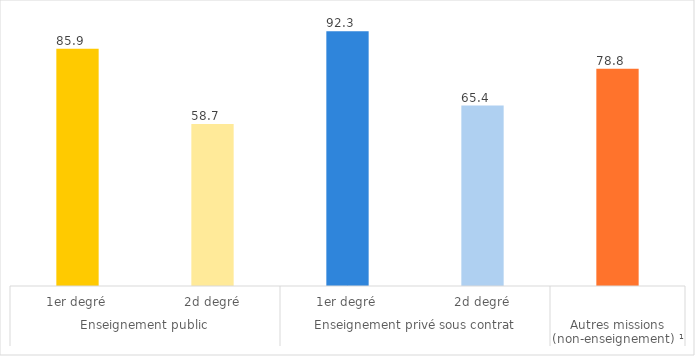
| Category | Part des femmes en % |
|---|---|
| 0 | 85.92 |
| 1 | 58.73 |
| 2 | 92.29 |
| 3 | 65.36 |
| 4 | 78.75 |